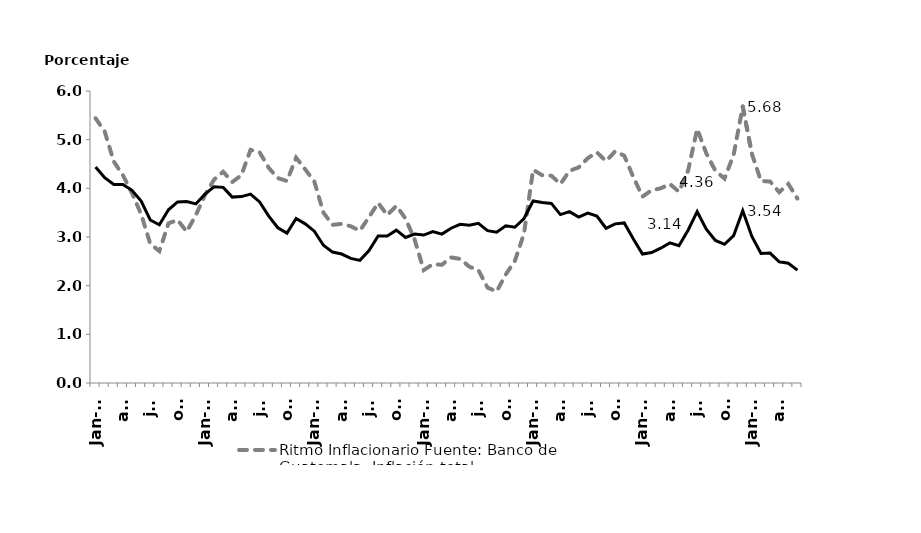
| Category | Ritmo Inflacionario Fuente: Banco de Guatemala Inflación total |   Inflación subyacente |
|---|---|---|
| ene-12 | 5.44 | 4.44 |
| feb | 5.17 | 4.22 |
| mar | 4.55 | 4.08 |
| abr | 4.27 | 4.08 |
| may | 3.9 | 3.96 |
| jun | 3.47 | 3.74 |
| jul | 2.86 | 3.35 |
| ago | 2.71 | 3.25 |
| sep | 3.28 | 3.56 |
| oct | 3.35 | 3.72 |
| nov | 3.11 | 3.73 |
| dic | 3.45 | 3.68 |
| ene-13 | 3.86 | 3.88 |
| feb | 4.18 | 4.03 |
| mar | 4.34 | 4.02 |
| abr | 4.13 | 3.82 |
| may | 4.27 | 3.83 |
| jun | 4.79 | 3.88 |
| jul | 4.74 | 3.72 |
| ago | 4.42 | 3.43 |
| sep | 4.21 | 3.19 |
| oct | 4.15 | 3.08 |
| nov | 4.63 | 3.38 |
| dic | 4.39 | 3.27 |
| ene-14 | 4.14 | 3.12 |
| feb | 3.5 | 2.83 |
| mar | 3.25 | 2.69 |
| abr | 3.27 | 2.65 |
| may | 3.22 | 2.56 |
| jun | 3.13 | 2.52 |
| jul | 3.41 | 2.72 |
| ago | 3.7 | 3.02 |
| sep | 3.45 | 3.02 |
| oct | 3.64 | 3.14 |
| nov | 3.38 | 2.99 |
| dic | 2.95 | 3.06 |
| ene-15 | 2.32 | 3.04 |
| feb | 2.44 | 3.11 |
| mar | 2.43 | 3.06 |
| abr | 2.58 | 3.18 |
| may | 2.55 | 3.26 |
| jun | 2.39 | 3.24 |
| jul | 2.32 | 3.28 |
| ago | 1.96 | 3.13 |
| sep | 1.88 | 3.1 |
| oct | 2.23 | 3.23 |
| nov | 2.51 | 3.2 |
| dic | 3.07 | 3.38 |
| ene-16 | 4.38 | 3.74 |
| feb | 4.27 | 3.71 |
| mar | 4.26 | 3.69 |
| abr | 4.09 | 3.46 |
| may | 4.36 | 3.52 |
| jun | 4.43 | 3.41 |
| jul | 4.62 | 3.49 |
| ago | 4.74 | 3.43 |
| sep | 4.56 | 3.18 |
| oct | 4.76 | 3.27 |
| nov | 4.67 | 3.29 |
| dic | 4.23 | 2.96 |
| ene-17 | 3.83 | 2.65 |
| feb | 3.96 | 2.68 |
| mar | 4 | 2.77 |
| abr | 4.09 | 2.88 |
| may | 3.93 | 2.82 |
| jun | 4.36 | 3.14 |
| jul | 5.22 | 3.52 |
| ago | 4.72 | 3.16 |
| sep | 4.36 | 2.93 |
| oct | 4.2 | 2.85 |
| nov | 4.69 | 3.03 |
| dic | 5.68 | 3.54 |
| ene-18 | 4.71 | 3.01 |
| feb | 4.15 | 2.66 |
| mar | 4.14 | 2.67 |
| abr | 3.92 | 2.49 |
| may | 4.09 | 2.46 |
| jun | 3.79 | 2.32 |